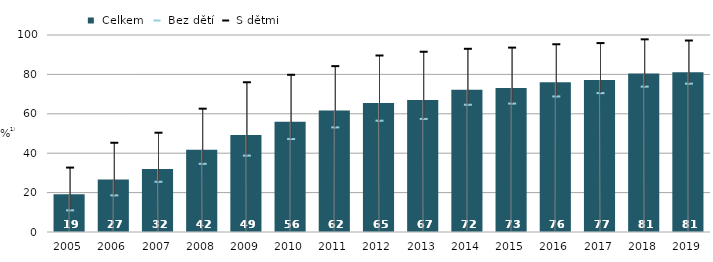
| Category |  Celkem |
|---|---|
| 2005.0 | 19.1 |
| 2006.0 | 26.7 |
| 2007.0 | 32 |
| 2008.0 | 41.7 |
| 2009.0 | 49.2 |
| 2010.0 | 56 |
| 2011.0 | 61.7 |
| 2012.0 | 65.436 |
| 2013.0 | 66.953 |
| 2014.0 | 72.147 |
| 2015.0 | 73.076 |
| 2016.0 | 76.074 |
| 2017.0 | 77.2 |
| 2018.0 | 80.5 |
| 2019.0 | 81.1 |